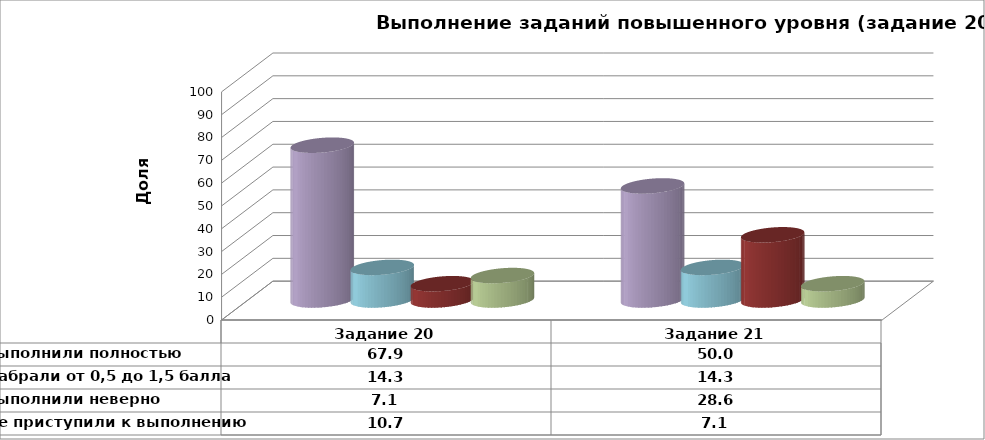
| Category | Series 1 | Выполнили полностью | Series 3 | Набрали от 0,5 до 1,5 балла | Series 5 | Выполнили неверно | Series 7 | Не приступили к выполнению |
|---|---|---|---|---|---|---|---|---|
| Задание 20 |  | 67.857 |  | 14.286 |  | 7.143 |  | 10.714 |
| Задание 21 |  | 50 |  | 14.286 |  | 28.571 |  | 7.143 |